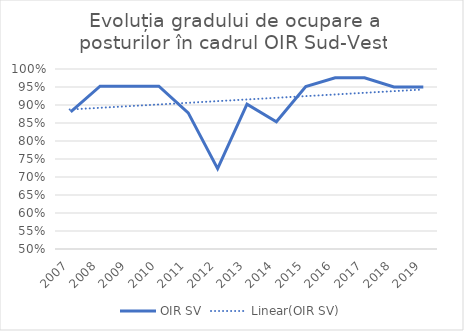
| Category | OIR SV |
|---|---|
| 2007.0 | 0.881 |
| 2008.0 | 0.952 |
| 2009.0 | 0.952 |
| 2010.0 | 0.952 |
| 2011.0 | 0.878 |
| 2012.0 | 0.723 |
| 2013.0 | 0.902 |
| 2014.0 | 0.854 |
| 2015.0 | 0.951 |
| 2016.0 | 0.976 |
| 2017.0 | 0.976 |
| 2018.0 | 0.95 |
| 2019.0 | 0.95 |